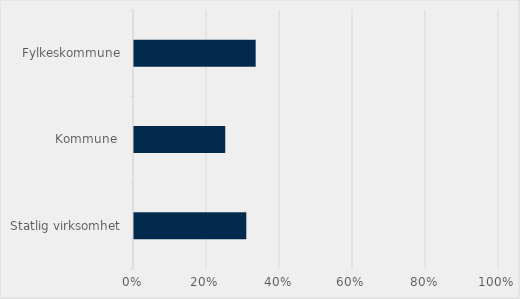
| Category | Prosent |
|---|---|
| Statlig virksomhet | 0.308 |
| Kommune  | 0.25 |
| Fylkeskommune | 0.333 |